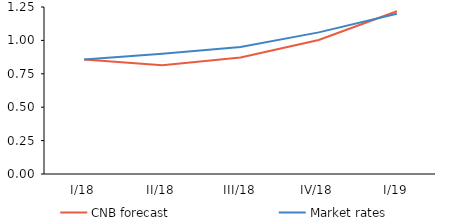
| Category | CNB forecast | Market rates |
|---|---|---|
| I/18 | 0.857 | 0.857 |
| II/18 | 0.814 | 0.9 |
| III/18 | 0.871 | 0.95 |
| IV/18 | 1.003 | 1.06 |
| I/19 | 1.219 | 1.2 |